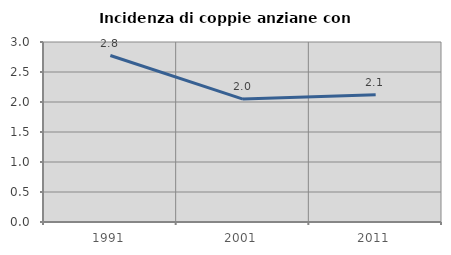
| Category | Incidenza di coppie anziane con figli |
|---|---|
| 1991.0 | 2.774 |
| 2001.0 | 2.049 |
| 2011.0 | 2.122 |